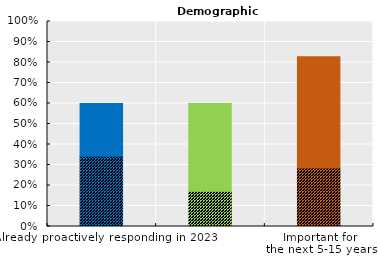
| Category | Demographic change | Series 1 |
|---|---|---|
| Already proactively responding in 2023 | 0.343 | 0.257 |
| Important for
2024 | 0.171 | 0.429 |
| Important for
the next 5-15 years | 0.286 | 0.543 |